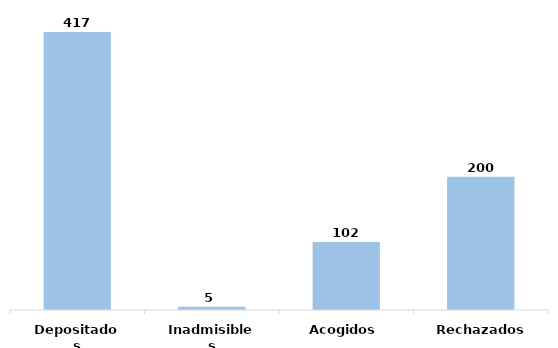
| Category | Series 0 |
|---|---|
| Depositados | 417 |
| Inadmisibles | 5 |
| Acogidos | 102 |
| Rechazados | 200 |